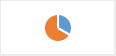
| Category | Section 2.D : Surveillance intégrée |
|---|---|
| 0 | 0.333 |
| 1 | 0.667 |